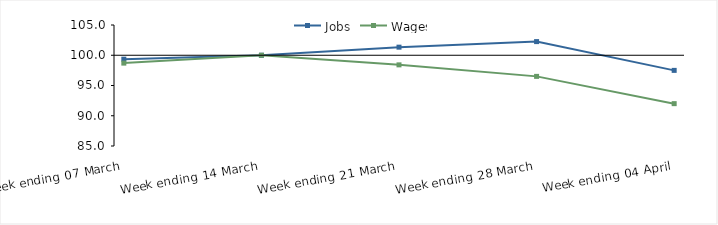
| Category | Jobs | Wages |
|---|---|---|
| 0 | 99.35 | 98.7 |
| 1900-01-01 | 100 | 100 |
| 1900-01-02 | 101.337 | 98.411 |
| 1900-01-03 | 102.256 | 96.508 |
| 1900-01-04 | 97.5 | 92 |